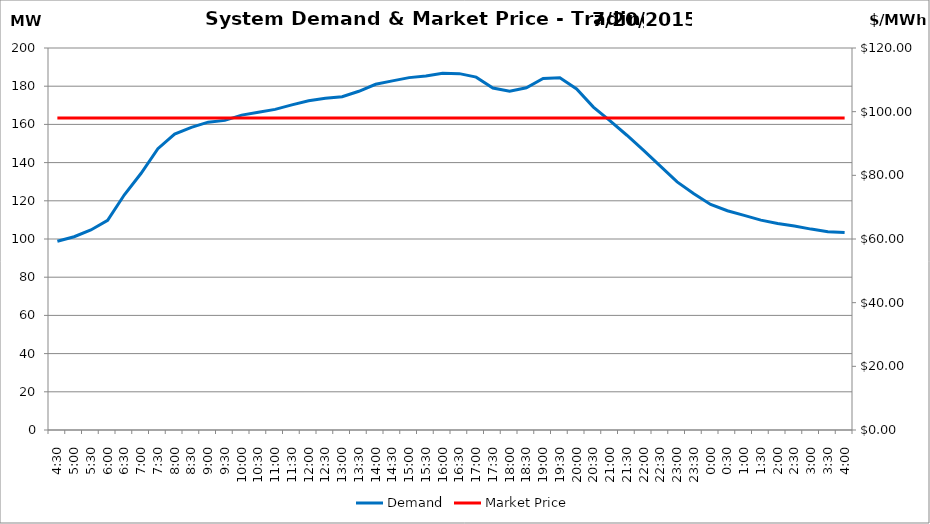
| Category | Demand |
|---|---|
| 0.1875 | 98.79 |
| 0.20833333333333334 | 101.2 |
| 0.22916666666666666 | 104.73 |
| 0.25 | 109.74 |
| 0.270833333333333 | 123.16 |
| 0.291666666666667 | 134.41 |
| 0.3125 | 147.31 |
| 0.333333333333333 | 154.89 |
| 0.354166666666667 | 158.45 |
| 0.375 | 161.16 |
| 0.395833333333333 | 162.11 |
| 0.416666666666667 | 164.86 |
| 0.4375 | 166.32 |
| 0.458333333333333 | 167.87 |
| 0.479166666666667 | 170.24 |
| 0.5 | 172.39 |
| 0.520833333333333 | 173.69 |
| 0.541666666666667 | 174.47 |
| 0.5625 | 177.35 |
| 0.583333333333333 | 181.02 |
| 0.604166666666667 | 182.8 |
| 0.625 | 184.49 |
| 0.645833333333334 | 185.39 |
| 0.666666666666667 | 186.75 |
| 0.6875 | 186.57 |
| 0.708333333333334 | 184.74 |
| 0.729166666666667 | 179.02 |
| 0.75 | 177.38 |
| 0.770833333333334 | 179.14 |
| 0.791666666666667 | 184.04 |
| 0.8125 | 184.4 |
| 0.833333333333334 | 178.57 |
| 0.854166666666667 | 169.07 |
| 0.875 | 161.89 |
| 0.895833333333334 | 154.32 |
| 0.916666666666667 | 146.39 |
| 0.9375 | 138.19 |
| 0.958333333333334 | 129.87 |
| 0.979166666666667 | 123.67 |
| 1900-01-01 | 118.1 |
| 1900-01-01 00:30:00 | 114.8 |
| 1900-01-01 01:00:00 | 112.36 |
| 1900-01-01 01:30:00 | 109.88 |
| 1900-01-01 02:00:00 | 108.08 |
| 1900-01-01 02:30:00 | 106.76 |
| 1900-01-01 03:00:00 | 105.18 |
| 1900-01-01 03:30:00 | 103.82 |
| 1900-01-01 04:00:00 | 103.34 |